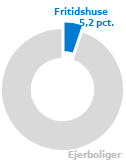
| Category | Series 0 |
|---|---|
|  Fritidshuse  | 5.19 |
|  Ejerboliger  | 94.81 |